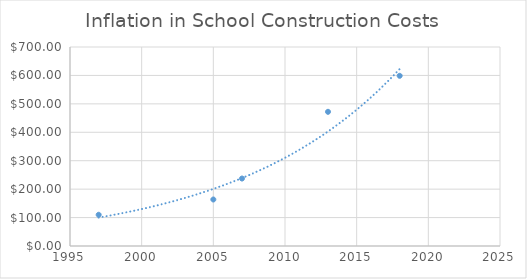
| Category | Series 0 |
|---|---|
| 1997.0 | 109.84 |
| 2005.0 | 163.584 |
| 2007.0 | 237.342 |
| 2013.0 | 472.017 |
| 2018.0 | 598.664 |